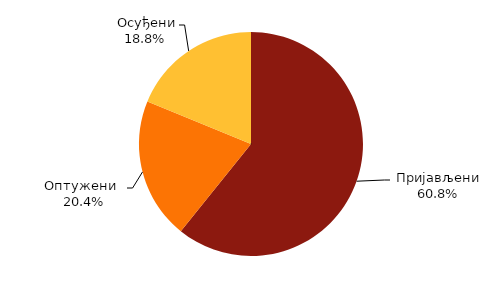
| Category | Series 0 |
|---|---|
|  Пријављени  | 13169 |
| Оптужени   | 4426 |
|  Осуђени | 4072 |